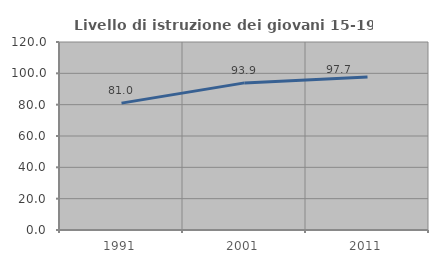
| Category | Livello di istruzione dei giovani 15-19 anni |
|---|---|
| 1991.0 | 80.99 |
| 2001.0 | 93.899 |
| 2011.0 | 97.692 |